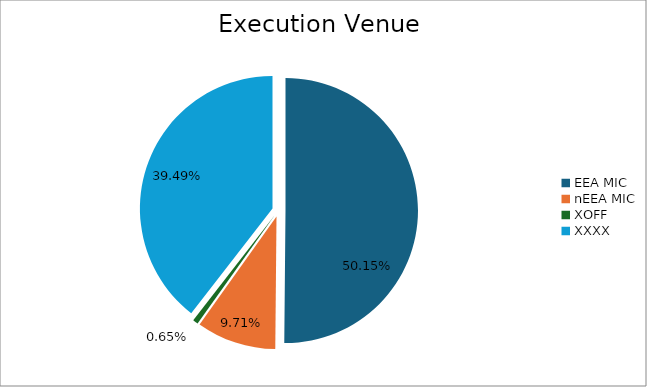
| Category | Series 0 |
|---|---|
| EEA MIC | 6592354.495 |
| nEEA MIC | 1276519.536 |
| XOFF | 85509.037 |
| XXXX | 5191465.676 |